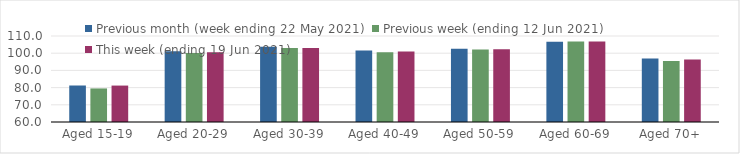
| Category | Previous month (week ending 22 May 2021) | Previous week (ending 12 Jun 2021) | This week (ending 19 Jun 2021) |
|---|---|---|---|
| Aged 15-19 | 81.22 | 79.51 | 81.18 |
| Aged 20-29 | 101.14 | 100.17 | 100.5 |
| Aged 30-39 | 103.81 | 102.99 | 103.01 |
| Aged 40-49 | 101.54 | 100.62 | 100.96 |
| Aged 50-59 | 102.54 | 102.09 | 102.27 |
| Aged 60-69 | 106.65 | 106.76 | 106.79 |
| Aged 70+ | 96.94 | 95.53 | 96.31 |